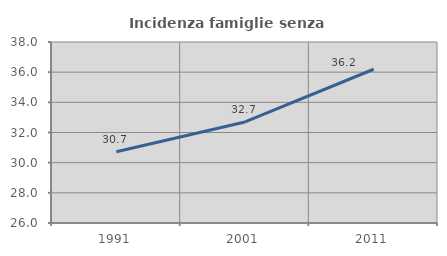
| Category | Incidenza famiglie senza nuclei |
|---|---|
| 1991.0 | 30.723 |
| 2001.0 | 32.7 |
| 2011.0 | 36.193 |